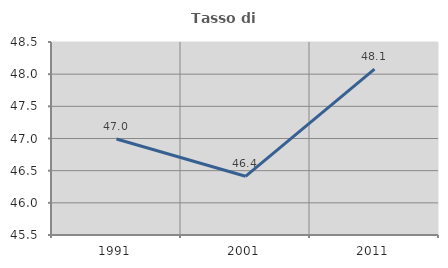
| Category | Tasso di occupazione   |
|---|---|
| 1991.0 | 46.992 |
| 2001.0 | 46.412 |
| 2011.0 | 48.079 |